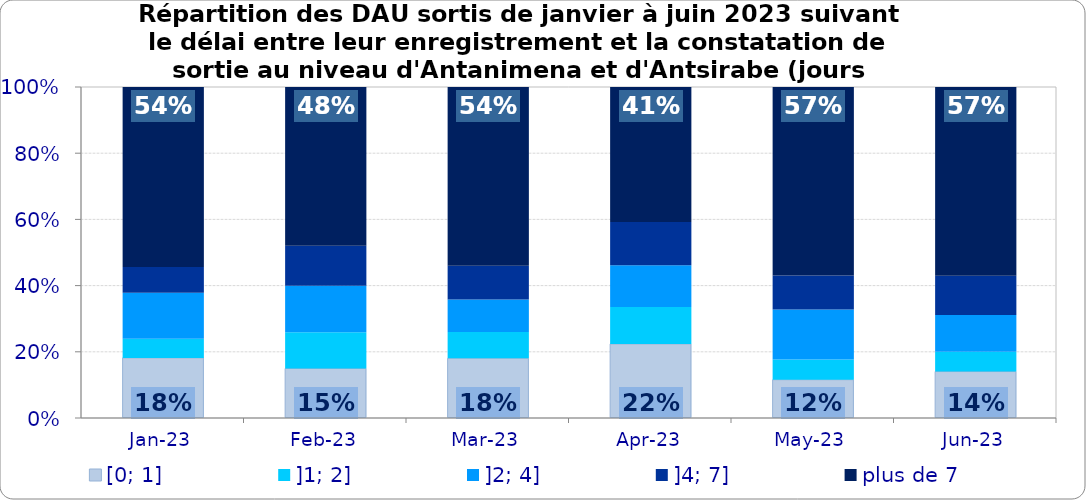
| Category | [0; 1] | ]1; 2] | ]2; 4] | ]4; 7] | plus de 7 |
|---|---|---|---|---|---|
| 2023-01-01 | 0.182 | 0.058 | 0.138 | 0.078 | 0.544 |
| 2023-02-01 | 0.15 | 0.11 | 0.141 | 0.121 | 0.479 |
| 2023-03-01 | 0.18 | 0.079 | 0.099 | 0.102 | 0.54 |
| 2023-04-01 | 0.224 | 0.112 | 0.126 | 0.13 | 0.408 |
| 2023-05-01 | 0.116 | 0.061 | 0.152 | 0.103 | 0.569 |
| 2023-06-01 | 0.14 | 0.06 | 0.111 | 0.119 | 0.57 |